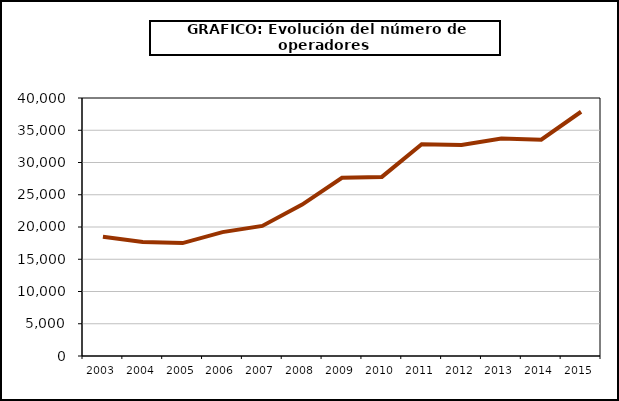
| Category | Operadores (*) |
|---|---|
| 2003.0 | 18505 |
| 2004.0 | 17688 |
| 2005.0 | 17509 |
| 2006.0 | 19211 |
| 2007.0 | 20171 |
| 2008.0 | 23473 |
| 2009.0 | 27627 |
| 2010.0 | 27767 |
| 2011.0 | 32837 |
| 2012.0 | 32724 |
| 2013.0 | 33704 |
| 2014.0 | 33539 |
| 2015.0 | 37870 |